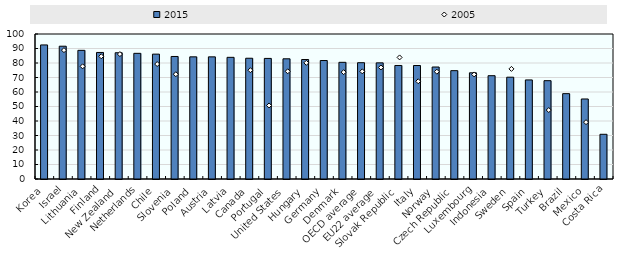
| Category | 2015 |
|---|---|
| Korea | 92.462 |
| Israel | 91.58 |
| Lithuania | 88.734 |
| Finland | 87.267 |
| New Zealand | 87.073 |
| Netherlands | 86.662 |
| Chile | 86.113 |
| Slovenia | 84.501 |
| Poland | 84.244 |
| Austria | 84.238 |
| Latvia | 83.907 |
| Canada | 83.282 |
| Portugal | 83.165 |
| United States | 82.894 |
| Hungary | 82.398 |
| Germany | 81.706 |
| Denmark | 80.47 |
| OECD average | 80.21 |
| EU22 average | 80.102 |
| Slovak Republic | 78.29 |
| Italy | 78.266 |
| Norway | 77.234 |
| Czech Republic | 74.728 |
| Luxembourg | 73.24 |
| Indonesia | 71.247 |
| Sweden | 70.213 |
| Spain | 68.329 |
| Turkey | 67.811 |
| Brazil | 58.861 |
| Mexico | 55.186 |
| Costa Rica | 30.832 |